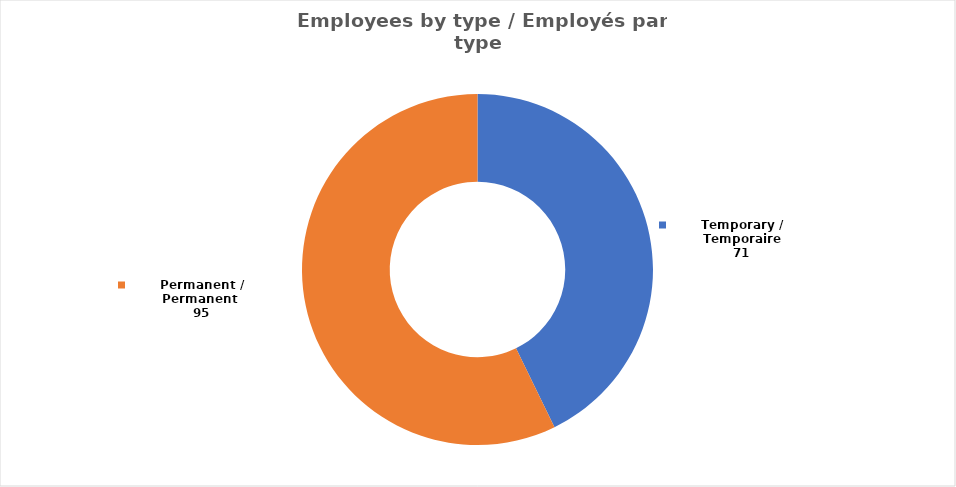
| Category | Series 0 |
|---|---|
| Temporary / Temporaire | 71 |
| Permanent / Permanent  | 95 |